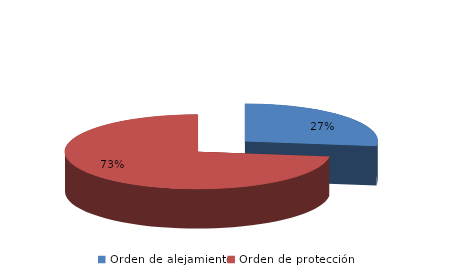
| Category | Series 0 |
|---|---|
| Orden de alejamiento | 206 |
| Orden de protección | 556 |